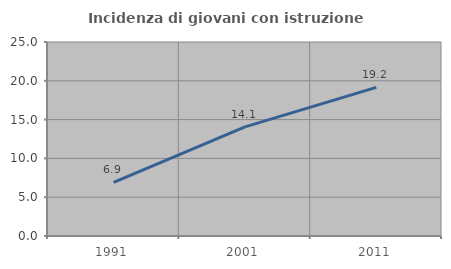
| Category | Incidenza di giovani con istruzione universitaria |
|---|---|
| 1991.0 | 6.91 |
| 2001.0 | 14.056 |
| 2011.0 | 19.153 |